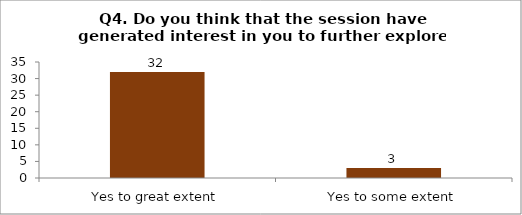
| Category | Q4. Do you think that the session have generated interest in you to further explore the topics? |
|---|---|
| Yes to great extent | 32 |
| Yes to some extent | 3 |